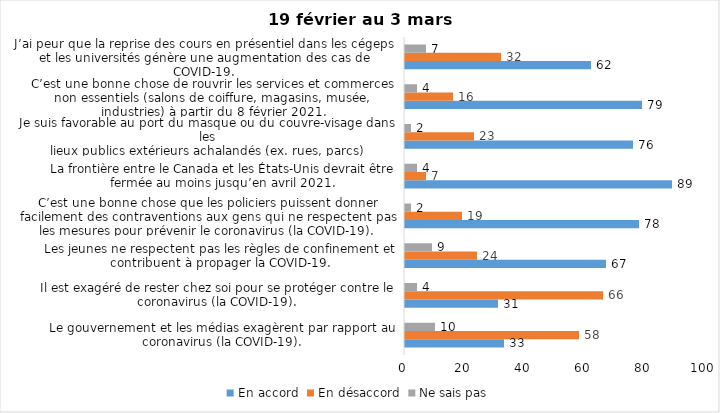
| Category | En accord | En désaccord | Ne sais pas |
|---|---|---|---|
| Le gouvernement et les médias exagèrent par rapport au coronavirus (la COVID-19). | 33 | 58 | 10 |
| Il est exagéré de rester chez soi pour se protéger contre le coronavirus (la COVID-19). | 31 | 66 | 4 |
| Les jeunes ne respectent pas les règles de confinement et contribuent à propager la COVID-19. | 67 | 24 | 9 |
| C’est une bonne chose que les policiers puissent donner facilement des contraventions aux gens qui ne respectent pas les mesures pour prévenir le coronavirus (la COVID-19). | 78 | 19 | 2 |
| La frontière entre le Canada et les États-Unis devrait être fermée au moins jusqu’en avril 2021. | 89 | 7 | 4 |
| Je suis favorable au port du masque ou du couvre-visage dans les
lieux publics extérieurs achalandés (ex. rues, parcs) | 76 | 23 | 2 |
| C’est une bonne chose de rouvrir les services et commerces non essentiels (salons de coiffure, magasins, musée, industries) à partir du 8 février 2021. | 79 | 16 | 4 |
| J’ai peur que la reprise des cours en présentiel dans les cégeps et les universités génère une augmentation des cas de COVID-19. | 62 | 32 | 7 |